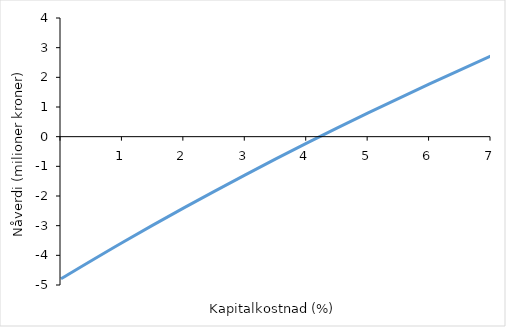
| Category | Series 0 |
|---|---|
| nan | -4.789 |
| 1.0 | -3.568 |
| 2.0 | -2.402 |
| 3.0 | -1.286 |
| 4.0 | -0.219 |
| 5.0 | 0.803 |
| 6.0 | 1.781 |
| 7.0 | 2.719 |